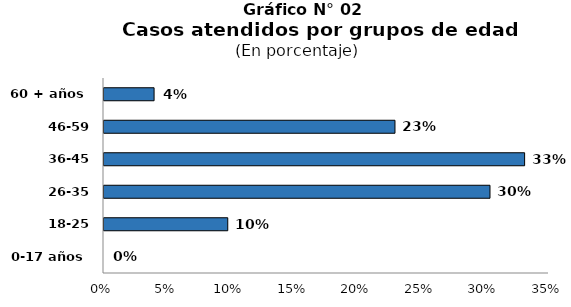
| Category | Series 0 |
|---|---|
| 0-17 años | 0 |
| 18-25 años | 0.097 |
| 26-35 años | 0.304 |
| 36-45 años | 0.331 |
| 46-59 años | 0.229 |
| 60 + años | 0.039 |